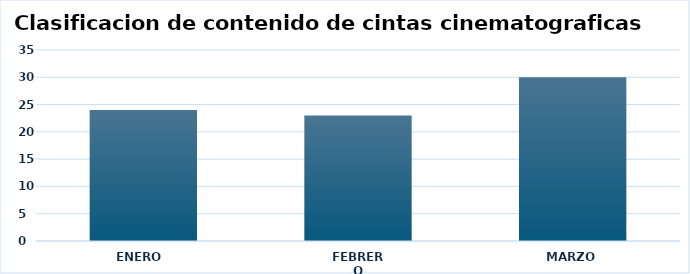
| Category | Diagrma de barras nota |
|---|---|
| ENERO  | 24 |
| FEBRERO | 23 |
| MARZO | 30 |